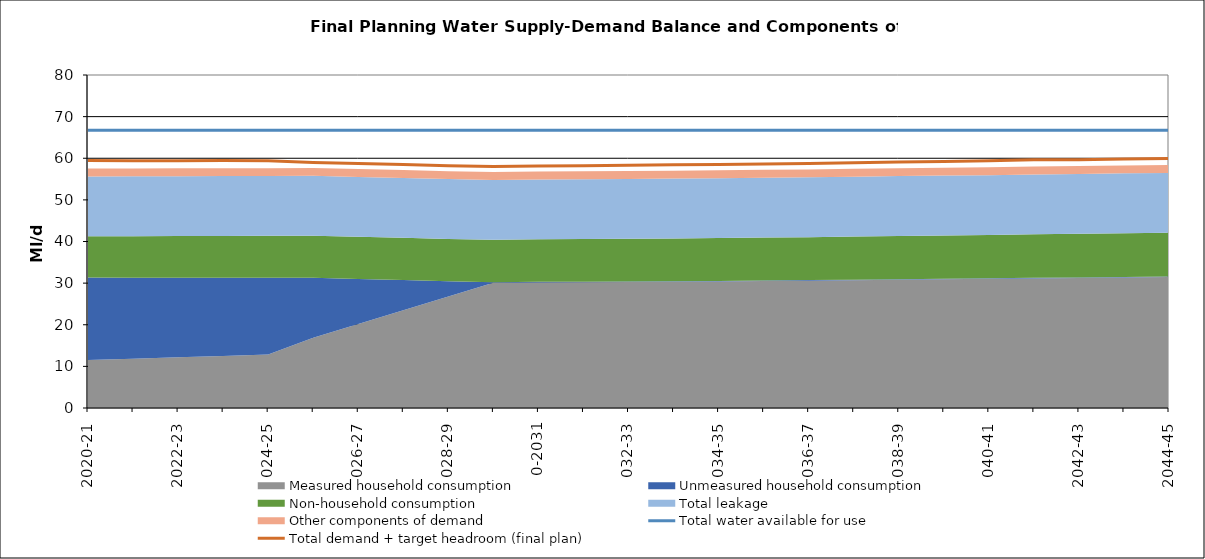
| Category | Total water available for use | Total demand + target headroom (final plan) |
|---|---|---|
| 0 | 66.707 | 59.462 |
| 1 | 66.707 | 59.376 |
| 2 | 66.707 | 59.42 |
| 3 | 66.707 | 59.446 |
| 4 | 66.707 | 59.427 |
| 5 | 66.707 | 59.007 |
| 6 | 66.707 | 58.736 |
| 7 | 66.707 | 58.513 |
| 8 | 66.707 | 58.213 |
| 9 | 66.707 | 58.027 |
| 10 | 66.707 | 58.122 |
| 11 | 66.707 | 58.197 |
| 12 | 66.707 | 58.306 |
| 13 | 66.707 | 58.41 |
| 14 | 66.707 | 58.497 |
| 15 | 66.707 | 58.631 |
| 16 | 66.707 | 58.752 |
| 17 | 66.707 | 58.938 |
| 18 | 66.707 | 59.115 |
| 19 | 66.707 | 59.203 |
| 20 | 66.707 | 59.407 |
| 21 | 66.707 | 59.616 |
| 22 | 66.707 | 59.61 |
| 23 | 66.707 | 59.803 |
| 24 | 66.707 | 59.958 |